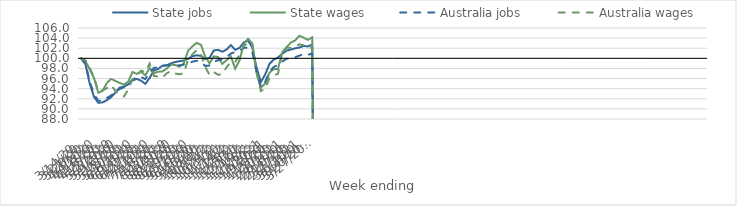
| Category | State jobs | State wages | Australia jobs | Australia wages |
|---|---|---|---|---|
| 14/03/2020 | 100 | 100 | 100 | 100 |
| 21/03/2020 | 98.848 | 99.471 | 98.97 | 99.607 |
| 28/03/2020 | 95.018 | 97.81 | 95.464 | 98.117 |
| 04/04/2020 | 92.395 | 96.113 | 92.906 | 96.324 |
| 11/04/2020 | 91.204 | 93.189 | 91.634 | 93.472 |
| 18/04/2020 | 91.288 | 93.555 | 91.618 | 93.672 |
| 25/04/2020 | 91.716 | 95.114 | 92.147 | 94.096 |
| 02/05/2020 | 92.302 | 95.96 | 92.646 | 94.684 |
| 09/05/2020 | 93.217 | 95.52 | 93.336 | 93.578 |
| 16/05/2020 | 94.211 | 95.139 | 93.928 | 92.809 |
| 23/05/2020 | 94.409 | 94.793 | 94.284 | 92.46 |
| 30/05/2020 | 94.842 | 95.384 | 94.792 | 93.812 |
| 06/06/2020 | 95.632 | 97.299 | 95.776 | 95.91 |
| 13/06/2020 | 95.928 | 96.929 | 96.277 | 96.583 |
| 20/06/2020 | 95.59 | 97.366 | 96.294 | 97.554 |
| 27/06/2020 | 94.948 | 96.643 | 95.892 | 97.289 |
| 04/07/2020 | 96.108 | 98.078 | 97.055 | 98.973 |
| 11/07/2020 | 97.592 | 97.057 | 98.106 | 96.533 |
| 18/07/2020 | 97.905 | 97.363 | 98.208 | 96.372 |
| 25/07/2020 | 98.555 | 97.407 | 98.434 | 96.181 |
| 01/08/2020 | 98.617 | 97.983 | 98.654 | 97.055 |
| 08/08/2020 | 99.011 | 98.79 | 98.656 | 97.48 |
| 15/08/2020 | 99.267 | 98.663 | 98.564 | 96.991 |
| 22/08/2020 | 99.436 | 98.351 | 98.619 | 96.84 |
| 29/08/2020 | 99.57 | 99.025 | 98.754 | 97.076 |
| 05/09/2020 | 99.906 | 101.513 | 98.928 | 99.803 |
| 12/09/2020 | 100.424 | 102.388 | 99.342 | 100.783 |
| 19/09/2020 | 100.606 | 103.054 | 99.517 | 101.637 |
| 26/09/2020 | 100.487 | 102.664 | 99.31 | 100.779 |
| 03/10/2020 | 99.854 | 100.349 | 98.488 | 98.325 |
| 10/10/2020 | 100.092 | 99.019 | 98.579 | 96.712 |
| 17/10/2020 | 101.552 | 100.389 | 99.343 | 97.299 |
| 24/10/2020 | 101.674 | 100.254 | 99.616 | 96.732 |
| 31/10/2020 | 101.308 | 98.914 | 99.832 | 96.893 |
| 07/11/2020 | 101.748 | 99.656 | 100.231 | 98.252 |
| 14/11/2020 | 102.616 | 100.358 | 100.956 | 99.261 |
| 21/11/2020 | 101.686 | 97.951 | 101.258 | 99.291 |
| 28/11/2020 | 102.055 | 99.55 | 101.546 | 100.638 |
| 05/12/2020 | 103.145 | 102.777 | 102.06 | 102.456 |
| 12/12/2020 | 103.531 | 103.874 | 102.096 | 102.885 |
| 19/12/2020 | 102.149 | 102.954 | 101.265 | 102.743 |
| 26/12/2020 | 98.156 | 97.059 | 97.433 | 97.212 |
| 02/01/2021 | 95.318 | 94.204 | 94.376 | 93.531 |
| 09/01/2021 | 96.77 | 95.007 | 95.285 | 93.978 |
| 16/01/2021 | 98.879 | 97.152 | 97.349 | 96.028 |
| 23/01/2021 | 99.747 | 97.868 | 98.277 | 96.664 |
| 30/01/2021 | 100.161 | 97.896 | 98.681 | 96.928 |
| 06/02/2021 | 100.9 | 101.216 | 99.348 | 101.023 |
| 13/02/2021 | 101.528 | 102.22 | 99.928 | 102.099 |
| 20/02/2021 | 101.724 | 103.128 | 99.969 | 102.073 |
| 27/02/2021 | 101.98 | 103.527 | 100.21 | 102.312 |
| 06/03/2021 | 102.126 | 104.457 | 100.53 | 102.759 |
| 13/03/2021 | 102.462 | 104.096 | 100.859 | 102.584 |
| 20/03/2021 | 102.351 | 103.657 | 100.674 | 102.081 |
| 27/03/2021 | 102.715 | 104.153 | 100.974 | 102.126 |